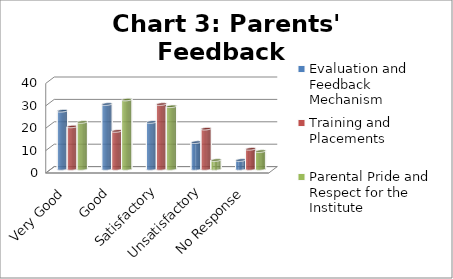
| Category | Evaluation and Feedback Mechanism | Training and Placements | Parental Pride and Respect for the Institute |
|---|---|---|---|
| Very Good | 26 | 19 | 21 |
| Good | 29 | 17 | 31 |
| Satisfactory | 21 | 29 | 28 |
| Unsatisfactory | 12 | 18 | 4 |
| No Response | 4 | 9 | 8 |